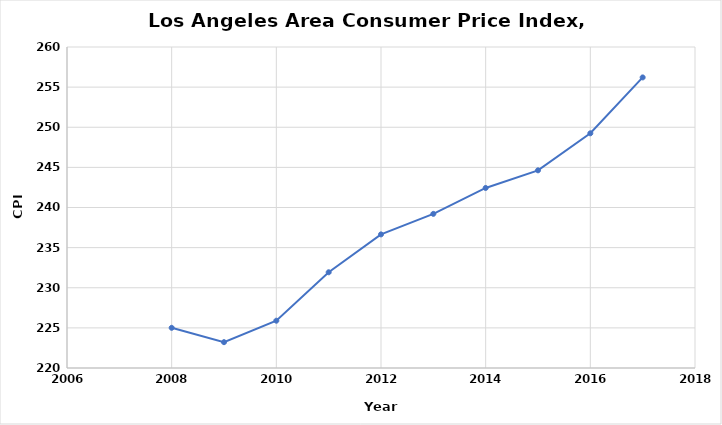
| Category | Series 0 |
|---|---|
| 2017.0 | 256.21 |
| 2016.0 | 249.246 |
| 2015.0 | 244.632 |
| 2014.0 | 242.434 |
| 2013.0 | 239.207 |
| 2012.0 | 236.648 |
| 2011.0 | 231.928 |
| 2010.0 | 225.894 |
| 2009.0 | 223.219 |
| 2008.0 | 225.008 |